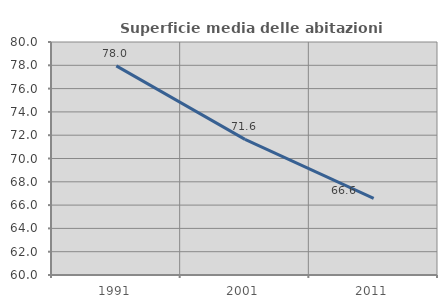
| Category | Superficie media delle abitazioni occupate |
|---|---|
| 1991.0 | 77.954 |
| 2001.0 | 71.642 |
| 2011.0 | 66.581 |